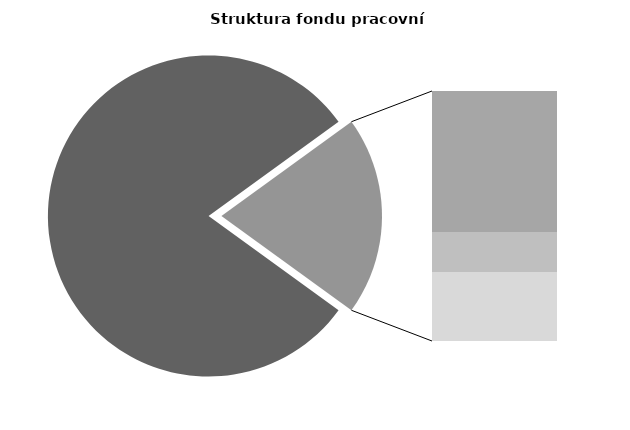
| Category | Series 0 |
|---|---|
| Průměrná měsíční odpracovaná doba bez přesčasu | 138.257 |
| Dovolená | 19.461 |
| Nemoc | 5.526 |
| Jiné | 9.521 |